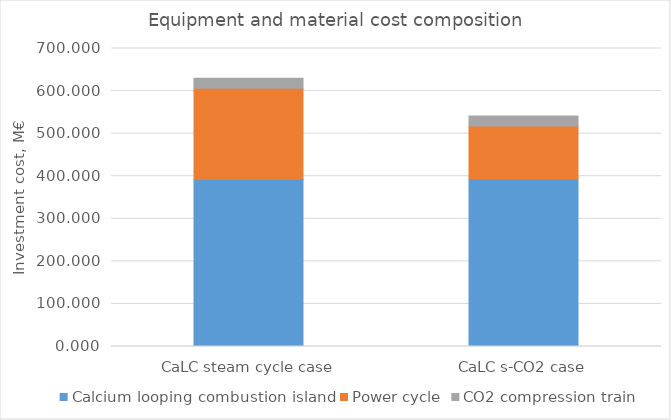
| Category | Calcium looping combustion island | Power cycle | CO2 compression train |
|---|---|---|---|
| CaLC steam cycle case | 392.272 | 214.443 | 23.53 |
| CaLC s-CO2 case | 393.543 | 124.206 | 23.758 |